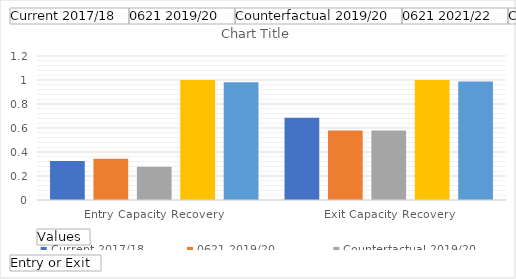
| Category | Current 2017/18 | 0621 2019/20  | Counterfactual 2019/20 | 0621 2021/22  | Counterfactual 2021/22 |
|---|---|---|---|---|---|
| Entry Capacity Recovery  | 0.324 | 0.343 | 0.277 | 1 | 0.981 |
| Exit Capacity Recovery  | 0.686 | 0.58 | 0.58 | 1 | 0.988 |